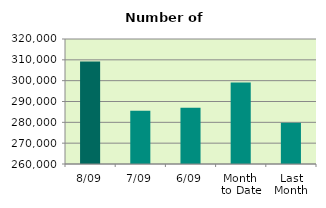
| Category | Series 0 |
|---|---|
| 8/09 | 309244 |
| 7/09 | 285526 |
| 6/09 | 286988 |
| Month 
to Date | 299137.667 |
| Last
Month | 279794.182 |